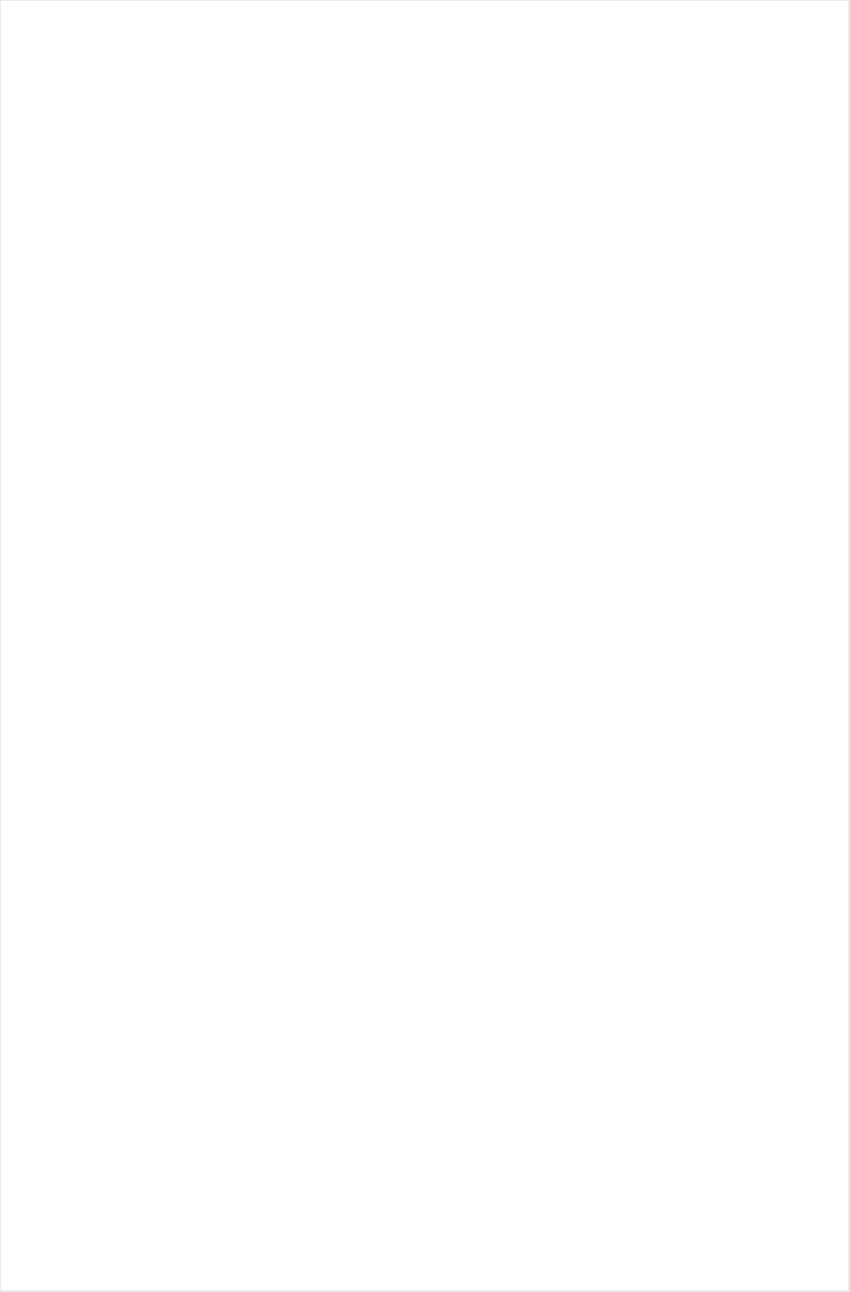
| Category | Total |
|---|---|
| ESPN Deportes | -0.206 |
| Nick Toons | -0.2 |
| Disney Channel | -0.195 |
| TUDN | -0.191 |
| VH1 | -0.189 |
| Disney Junior US | -0.186 |
| Nick Jr. | -0.184 |
| Nick | -0.182 |
| Univision | -0.176 |
| UniMas | -0.172 |
| Cartoon Network | -0.17 |
| Galavision | -0.165 |
| MTV2 | -0.164 |
| Telemundo | -0.163 |
| MTV | -0.149 |
| Adult Swim | -0.149 |
| Disney XD | -0.148 |
| Nick@Nite | -0.145 |
| truTV | -0.139 |
| Universal Kids | -0.13 |
| BET | -0.126 |
| Comedy Central | -0.123 |
| FXX | -0.12 |
| E! | -0.116 |
| NBC Universo | -0.113 |
| Freeform | -0.113 |
| TV ONE | -0.104 |
| Viceland | -0.103 |
| BET Her | -0.099 |
| NBA TV | -0.095 |
| FX | -0.082 |
| BRAVO | -0.076 |
| ESPNEWS | -0.076 |
| ESPN | -0.074 |
| SYFY | -0.063 |
| FXDEP | -0.061 |
| TNT | -0.06 |
| The Sportsman Channel | -0.047 |
| Discovery Family Channel | -0.046 |
| TBS | -0.046 |
| USA Network | -0.045 |
| Lifetime Movies | -0.045 |
| AMC | -0.044 |
| Paramount Network | -0.044 |
| NFL Network | -0.044 |
| A&E | -0.039 |
| Logo | -0.038 |
| Lifetime | -0.037 |
| ESPN2 | -0.037 |
| FX Movie Channel | -0.035 |
| CMTV | -0.022 |
| NHL | -0.017 |
| Independent Film (IFC) | -0.016 |
| BBC America | -0.016 |
| WE TV | -0.014 |
| Cooking Channel | -0.011 |
| Food Network | -0.01 |
| TLC | -0.008 |
| CW | -0.003 |
| Oprah Winfrey Network | -0.003 |
| CNBC | 0 |
| Discovery Channel | 0.003 |
| ESPNU | 0.004 |
| MyNetworkTV | 0.005 |
| Fox Sports 1 | 0.012 |
| Travel | 0.013 |
| FOX | 0.014 |
| Investigation Discovery | 0.016 |
| MLB Network | 0.019 |
| Ovation | 0.02 |
| Motor Trend Network | 0.028 |
| Discovery Life Channel | 0.03 |
| Reelz Channel | 0.03 |
| Destination America | 0.033 |
| OXYGEN | 0.033 |
| SundanceTV | 0.035 |
| National Geographic | 0.039 |
| POP | 0.04 |
| ABC | 0.046 |
| CNN | 0.048 |
| Olympic Channel | 0.048 |
| NBC | 0.049 |
| Game Show | 0.051 |
| Headline News | 0.055 |
| Animal Planet | 0.063 |
| ION | 0.064 |
| HGTV | 0.067 |
| History Channel | 0.07 |
| TV LAND | 0.071 |
| UP TV | 0.075 |
| DIY | 0.075 |
| FYI | 0.077 |
| Science Channel | 0.082 |
| Big Ten Network | 0.084 |
| Outdoor Channel | 0.088 |
| WGN America | 0.089 |
| Bloomberg HD | 0.093 |
| Great American Country | 0.099 |
| NBC Sports | 0.1 |
| National Geographic Wild | 0.102 |
| American Heroes Channel | 0.107 |
| Golf | 0.113 |
| CBS | 0.122 |
| Fox News | 0.123 |
| Weather Channel | 0.145 |
| CBS Sports | 0.145 |
| Smithsonian | 0.154 |
| Hallmark | 0.167 |
| PAC-12 Network | 0.174 |
| MSNBC | 0.184 |
| Tennis Channel | 0.186 |
| Fox Business | 0.213 |
| PBS | 0.218 |
| Hallmark Movies & Mysteries | 0.244 |
| INSP | 0.256 |
| RFD TV | 0.275 |